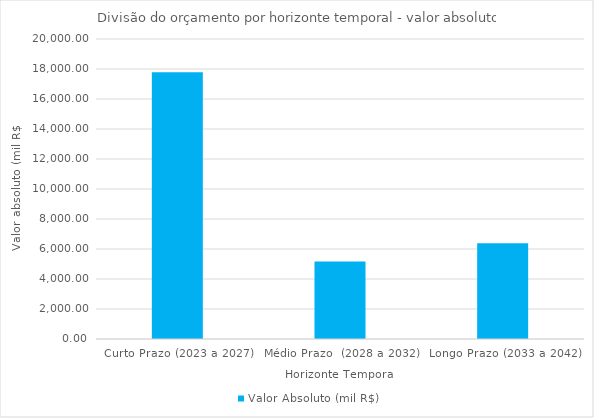
| Category | Valor Absoluto (mil R$) |
|---|---|
| Curto Prazo (2023 a 2027) | 17779.376 |
| Médio Prazo  (2028 a 2032) | 5160.39 |
| Longo Prazo (2033 a 2042) | 6381.213 |